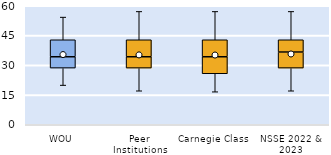
| Category | 25th | 50th | 75th |
|---|---|---|---|
| WOU | 28.571 | 5.714 | 8.571 |
| Peer Institutions | 28.571 | 5.714 | 8.571 |
| Carnegie Class | 25.714 | 8.571 | 8.571 |
| NSSE 2022 & 2023 | 28.571 | 8.095 | 6.19 |